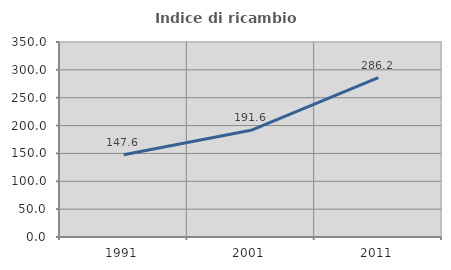
| Category | Indice di ricambio occupazionale  |
|---|---|
| 1991.0 | 147.619 |
| 2001.0 | 191.579 |
| 2011.0 | 286.17 |